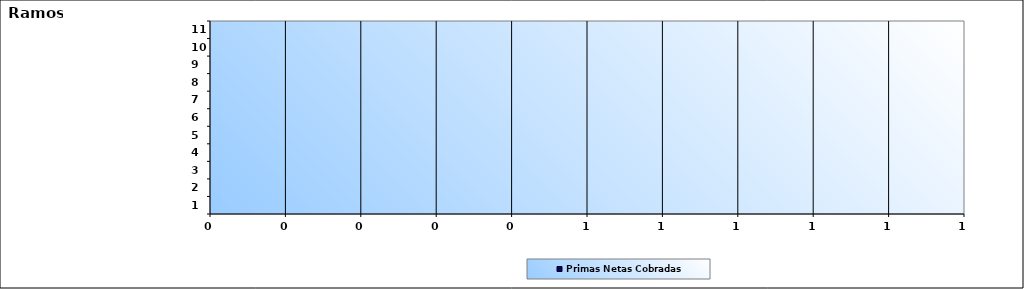
| Category | Primas Netas Cobradas |
|---|---|
| 0 | 0 |
| 1 | 0 |
| 2 | 0 |
| 3 | 0 |
| 4 | 0 |
| 5 | 0 |
| 6 | 0 |
| 7 | 0 |
| 8 | 0 |
| 9 | 0 |
| 10 | 0 |